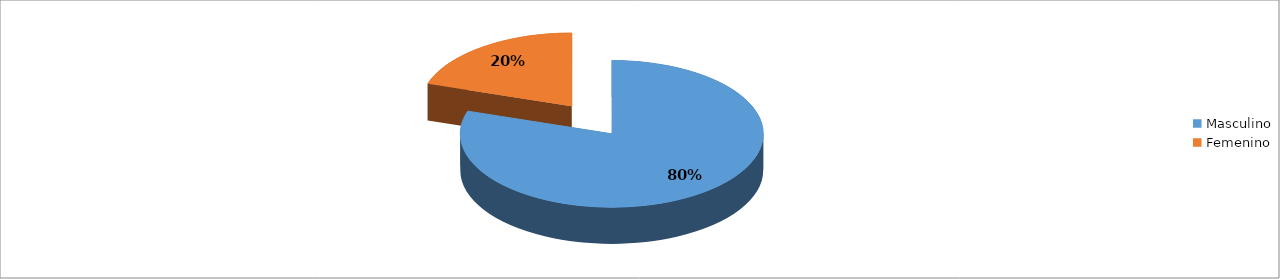
| Category | Series 0 |
|---|---|
| Masculino | 0.8 |
| Femenino | 0.2 |